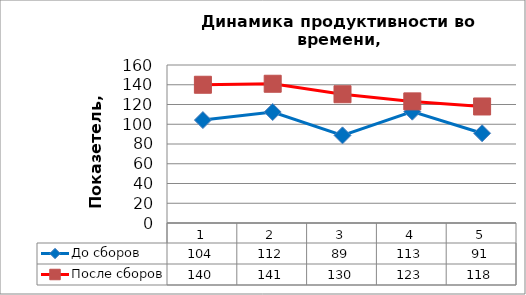
| Category | До сборов | После сборов |
|---|---|---|
| 0 | 104.211 | 140 |
| 1 | 112.368 | 141 |
| 2 | 88.759 | 130.378 |
| 3 | 112.727 | 123.152 |
| 4 | 90.87 | 118 |